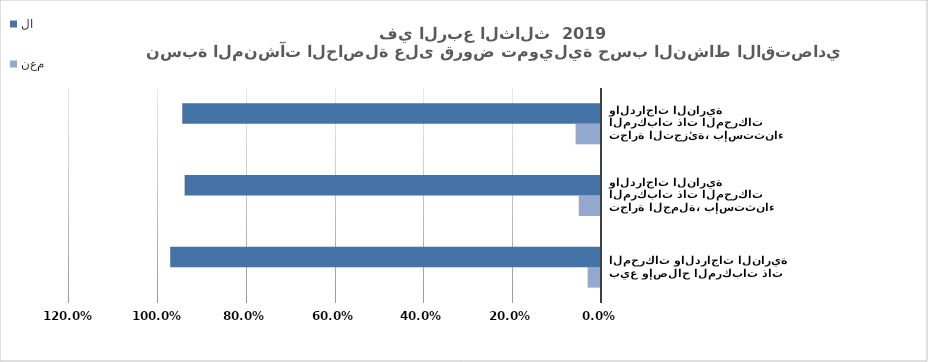
| Category | نعم | لا |
|---|---|---|
| بيع وإصلاح المركبات ذات المحركات والدراجات النارية | 0.03 | 0.97 |
| تجارة الجملة، بإستثناء المركبات ذات المحركات والدراجات النارية | 0.05 | 0.937 |
| تجارة التجزئة، بإستثناء المركبات ذات المحركات والدراجات النارية | 0.057 | 0.943 |